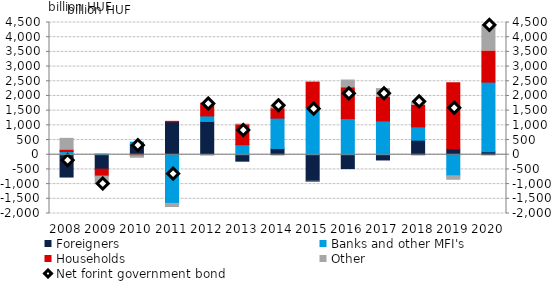
| Category | Foreigners | Banks and other MFI's | Households | Other |
|---|---|---|---|---|
| 2008.0 | -759.65 | 107.753 | 57.047 | 392.2 |
| 2009.0 | -491.4 | 23.556 | -236.156 | -293.241 |
| 2010.0 | 358.869 | 68.381 | -32.221 | -87.487 |
| 2011.0 | 1124.084 | -1656.51 | 11.985 | -139.476 |
| 2012.0 | 1130.805 | 189.835 | 433.858 | -29.175 |
| 2013.0 | -219.704 | 342.911 | 675.773 | 24.837 |
| 2014.0 | 209.723 | 1035.767 | 320.976 | 103.968 |
| 2015.0 | -901.505 | 1614.165 | 857.987 | -21.991 |
| 2016.0 | -472.926 | 1229.477 | 1051.766 | 261.126 |
| 2017.0 | -178.442 | 1151.054 | 813.833 | 286.152 |
| 2018.0 | 495.617 | 454.277 | 738.786 | 106.873 |
| 2019.0 | 191.548 | -715.328 | 2258.343 | -154.373 |
| 2020.0 | 98.531 | 2372.071 | 1061.422 | 872.128 |